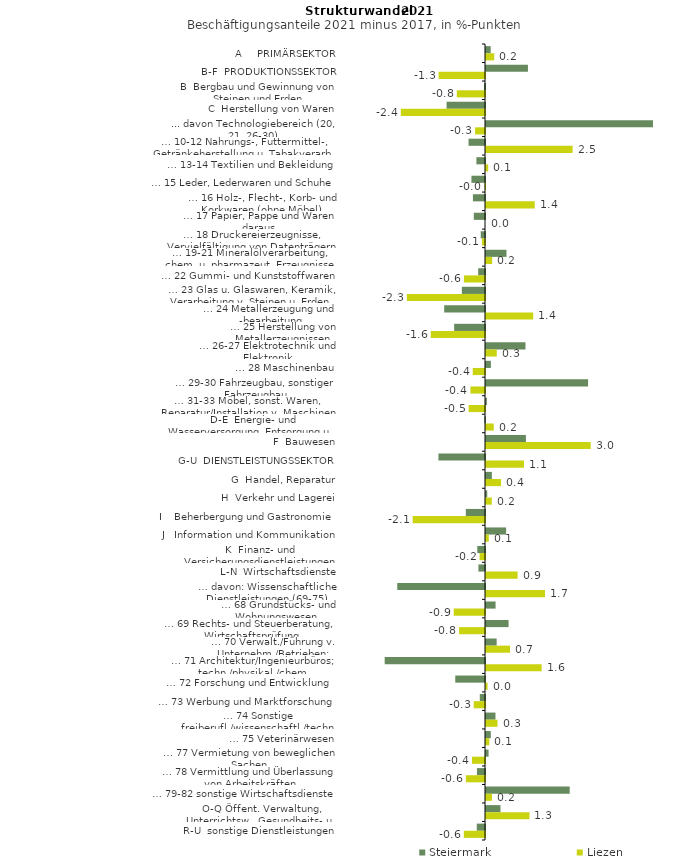
| Category | Steiermark | Liezen |
|---|---|---|
| A     PRIMÄRSEKTOR | 0.135 | 0.238 |
| B-F  PRODUKTIONSSEKTOR | 1.215 | -1.344 |
| B  Bergbau und Gewinnung von Steinen und Erden | -0.029 | -0.818 |
| C  Herstellung von Waren | -1.114 | -2.441 |
| ... davon Technologiebereich (20, 21, 26-30) | 4.84 | -0.288 |
| … 10-12 Nahrungs-, Futtermittel-, Getränkeherstellung u. Tabakverarb. | -0.477 | 2.51 |
| … 13-14 Textilien und Bekleidung | -0.249 | 0.064 |
| … 15 Leder, Lederwaren und Schuhe | -0.393 | -0.008 |
| … 16 Holz-, Flecht-, Korb- und Korkwaren (ohne Möbel)  | -0.35 | 1.413 |
| … 17 Papier, Pappe und Waren daraus  | -0.325 | 0 |
| … 18 Druckereierzeugnisse, Vervielfältigung von Datenträgern | -0.124 | -0.089 |
| … 19-21 Mineralölverarbeitung, chem. u. pharmazeut. Erzeugnisse | 0.594 | 0.178 |
| … 22 Gummi- und Kunststoffwaren | -0.198 | -0.611 |
| … 23 Glas u. Glaswaren, Keramik, Verarbeitung v. Steinen u. Erden  | -0.671 | -2.265 |
| … 24 Metallerzeugung und -bearbeitung | -1.183 | 1.369 |
| … 25 Herstellung von Metallerzeugnissen  | -0.894 | -1.572 |
| … 26-27 Elektrotechnik und Elektronik | 1.144 | 0.312 |
| … 28 Maschinenbau | 0.141 | -0.356 |
| … 29-30 Fahrzeugbau, sonstiger Fahrzeugbau | 2.959 | -0.422 |
| … 31-33 Möbel, sonst. Waren, Reparatur/Installation v. Maschinen | 0.026 | -0.475 |
| D-E  Energie- und Wasserversorgung, Entsorgung u. Rückgewinnung | -0.016 | 0.224 |
| F  Bauwesen | 1.158 | 3.035 |
| G-U  DIENSTLEISTUNGSSEKTOR | -1.351 | 1.102 |
| G  Handel, Reparatur | 0.17 | 0.436 |
| H  Verkehr und Lagerei | 0.036 | 0.168 |
| I    Beherbergung und Gastronomie | -0.556 | -2.096 |
| J   Information und Kommunikation | 0.584 | 0.08 |
| K  Finanz- und Versicherungsdienstleistungen | -0.224 | -0.156 |
| L-N  Wirtschaftsdienste | -0.191 | 0.917 |
| … davon: Wissenschaftliche Dienstleistungen (69-75) | -2.544 | 1.709 |
| … 68 Grundstücks- und Wohnungswesen  | 0.278 | -0.907 |
| … 69 Rechts- und Steuerberatung, Wirtschaftsprüfung | 0.654 | -0.751 |
| … 70 Verwalt./Führung v. Unternehm./Betrieben; Unternehmensberat. | 0.309 | 0.698 |
| … 71 Architektur/Ingenieurbüros; techn./physikal./chem. Untersuchung | -2.908 | 1.613 |
| … 72 Forschung und Entwicklung  | -0.862 | 0.046 |
| … 73 Werbung und Marktforschung | -0.151 | -0.326 |
| … 74 Sonstige freiberufl./wissenschaftl./techn. Tätigkeiten | 0.275 | 0.334 |
| … 75 Veterinärwesen | 0.139 | 0.096 |
| … 77 Vermietung von beweglichen Sachen  | 0.075 | -0.377 |
| … 78 Vermittlung und Überlassung von Arbeitskräften | -0.233 | -0.554 |
| … 79-82 sonstige Wirtschaftsdienste | 2.426 | 0.174 |
| O-Q Öffent. Verwaltung, Unterrichtsw., Gesundheits- u. Sozialwesen | 0.419 | 1.26 |
| R-U  sonstige Dienstleistungen | -0.238 | -0.615 |